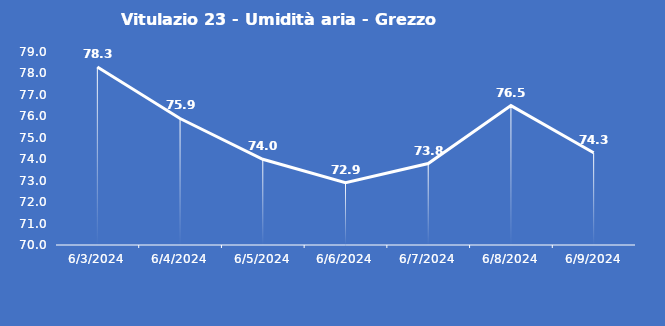
| Category | Vitulazio 23 - Umidità aria - Grezzo (%) |
|---|---|
| 6/3/24 | 78.3 |
| 6/4/24 | 75.9 |
| 6/5/24 | 74 |
| 6/6/24 | 72.9 |
| 6/7/24 | 73.8 |
| 6/8/24 | 76.5 |
| 6/9/24 | 74.3 |